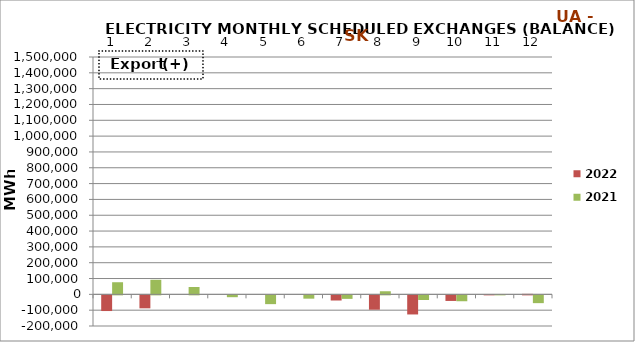
| Category | 2022 | 2021 |
|---|---|---|
| 0 | -99119 | 76598 |
| 1 | -81959 | 92160 |
| 2 | 0 | 46600 |
| 3 | 0 | -11643 |
| 4 | 0 | -55492 |
| 5 | 0 | -20932 |
| 6 | -32541 | -22162 |
| 7 | -90626 | 19617 |
| 8 | -120741 | -29379 |
| 9 | -35351 | -37268 |
| 10 | 127 | 1854 |
| 11 | 3137 | -49247 |